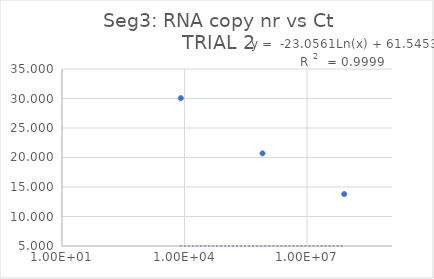
| Category | Series 0 |
|---|---|
| 81000000.0 | 13.8 |
| 810000.0 | 20.702 |
| 8100.0 | 30.069 |